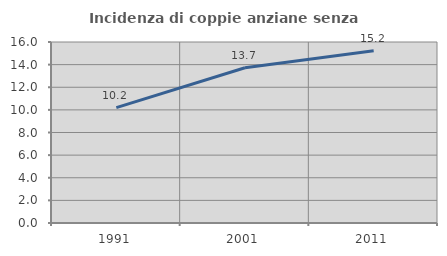
| Category | Incidenza di coppie anziane senza figli  |
|---|---|
| 1991.0 | 10.196 |
| 2001.0 | 13.725 |
| 2011.0 | 15.234 |